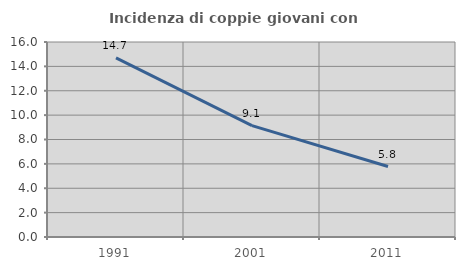
| Category | Incidenza di coppie giovani con figli |
|---|---|
| 1991.0 | 14.695 |
| 2001.0 | 9.14 |
| 2011.0 | 5.781 |